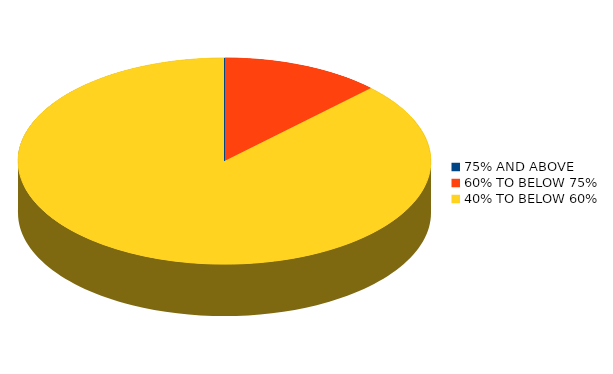
| Category | Number of students |
|---|---|
| 75% AND ABOVE | 0 |
| 60% TO BELOW 75% | 1 |
| 40% TO BELOW 60% | 7 |